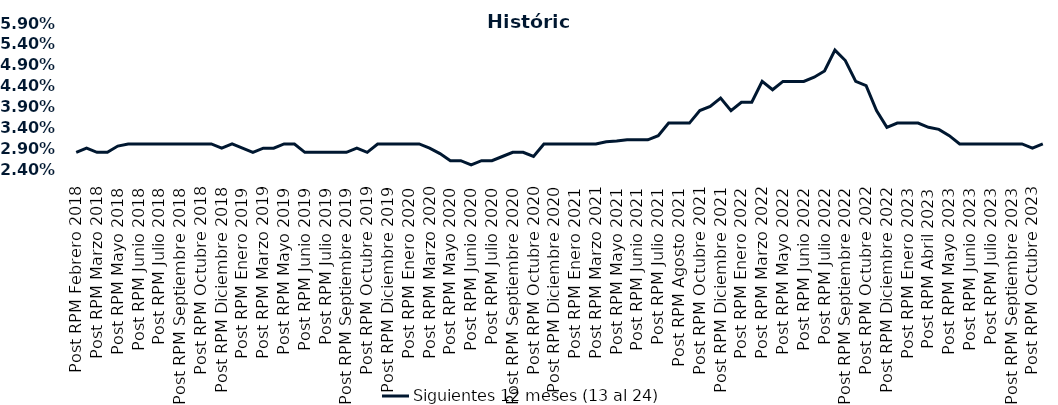
| Category | Siguientes 12 meses (13 al 24)  |
|---|---|
| Post RPM Febrero 2018 | 0.028 |
| Pre RPM Marzo 2018 | 0.029 |
| Post RPM Marzo 2018 | 0.028 |
| Pre RPM Mayo 2018 | 0.028 |
| Post RPM Mayo 2018 | 0.03 |
| Pre RPM Junio 2018 | 0.03 |
| Post RPM Junio 2018 | 0.03 |
| Pre RPM Julio 2018 | 0.03 |
| Post RPM Julio 2018 | 0.03 |
| Pre RPM Septiembre 2018 | 0.03 |
| Post RPM Septiembre 2018 | 0.03 |
| Pre RPM Octubre 2018 | 0.03 |
| Post RPM Octubre 2018 | 0.03 |
| Pre RPM Diciembre 2018 | 0.03 |
| Post RPM Diciembre 2018 | 0.029 |
| Pre RPM Enero 2019 | 0.03 |
| Post RPM Enero 2019 | 0.029 |
| Pre RPM Marzo 2019 | 0.028 |
| Post RPM Marzo 2019 | 0.029 |
| Pre RPM Mayo 2019 | 0.029 |
| Post RPM Mayo 2019 | 0.03 |
| Pre RPM Junio 2019 | 0.03 |
| Post RPM Junio 2019 | 0.028 |
| Pre RPM Julio 2019 | 0.028 |
| Post RPM Julio 2019 | 0.028 |
| Pre RPM Septiembre 2019 | 0.028 |
| Post RPM Septiembre 2019 | 0.028 |
| Pre RPM Octubre 2019 | 0.029 |
| Post RPM Octubre 2019 | 0.028 |
| Pre RPM Diciembre 2019 | 0.03 |
| Post RPM Diciembre 2019 | 0.03 |
| Pre RPM Enero 2020 | 0.03 |
| Post RPM Enero 2020 | 0.03 |
| Pre RPM Marzo 2020 | 0.03 |
| Post RPM Marzo 2020 | 0.029 |
| Pre RPM Mayo 2020 | 0.028 |
| Post RPM Mayo 2020 | 0.026 |
| Pre RPM Junio 2020 | 0.026 |
| Post RPM Junio 2020 | 0.025 |
| Pre RPM Julio 2020 | 0.026 |
| Post RPM Julio 2020 | 0.026 |
| Pre RPM Septiembre 2020 | 0.027 |
| Post RPM Septiembre 2020 | 0.028 |
| Pre RPM Octubre 2020 | 0.028 |
| Post RPM Octubre 2020 | 0.027 |
| Pre RPM Diciembre 2020 | 0.03 |
| Post RPM Diciembre 2020 | 0.03 |
| Pre RPM Enero 2021 | 0.03 |
| Post RPM Enero 2021 | 0.03 |
| Pre RPM Marzo 2021 | 0.03 |
| Post RPM Marzo 2021 | 0.03 |
| Pre RPM Mayo 2021 | 0.031 |
| Post RPM Mayo 2021 | 0.031 |
| Pre RPM Junio 2021 | 0.031 |
| Post RPM Junio 2021 | 0.031 |
| Pre RPM Julio 2021 | 0.031 |
| Post RPM Julio 2021 | 0.032 |
| Pre RPM Agosto 2021 | 0.035 |
| Post RPM Agosto 2021 | 0.035 |
| Pre RPM Octubre 2021 | 0.035 |
| Post RPM Octubre 2021 | 0.038 |
| Pre RPM Diciembre 2021 | 0.039 |
| Post RPM Diciembre 2021 | 0.041 |
| Pre RPM Enero 2022 | 0.038 |
| Post RPM Enero 2022 | 0.04 |
| Pre RPM Marzo 2022 | 0.04 |
| Post RPM Marzo 2022 | 0.045 |
| Pre RPM Mayo 2022 | 0.043 |
| Post RPM Mayo 2022 | 0.045 |
| Pre RPM Junio 2022 | 0.045 |
| Post RPM Junio 2022 | 0.045 |
| Pre RPM Julio 2022 | 0.046 |
| Post RPM Julio 2022 | 0.048 |
| Pre RPM Septiembre 2022 | 0.052 |
| Post RPM Septiembre 2022 | 0.05 |
| Pre RPM Octubre 2022 | 0.045 |
| Post RPM Octubre 2022 | 0.044 |
| Pre RPM Diciembre 2022 | 0.038 |
| Post RPM Diciembre 2022 | 0.034 |
| Pre RPM Enero 2023 | 0.035 |
| Post RPM Enero 2023 | 0.035 |
| Pre RPM Abril 2023 | 0.035 |
| Post RPM Abril 2023 | 0.034 |
| Pre RPM Mayo 2023 | 0.034 |
| Post RPM Mayo 2023 | 0.032 |
| Pre RPM Junio 2023 | 0.03 |
| Post RPM Junio 2023 | 0.03 |
| Pre RPM Julio 2023 | 0.03 |
| Post RPM Julio 2023 | 0.03 |
| Pre RPM Septiembre 2023 | 0.03 |
| Post RPM Septiembre 2023 | 0.03 |
| Pre RPM Octubre 2023 | 0.03 |
| Post RPM Octubre 2023 | 0.029 |
| Pre RPM Diciembre 2023 | 0.03 |